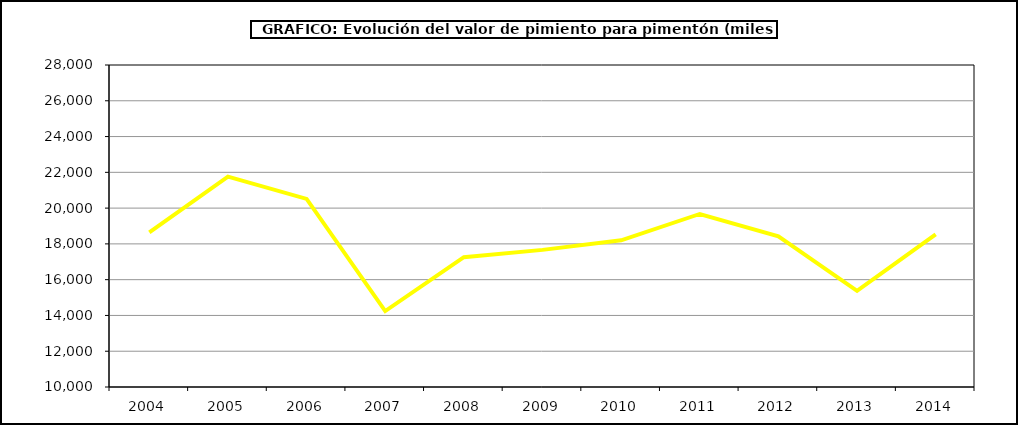
| Category | Valor |
|---|---|
| 2004.0 | 18641.666 |
| 2005.0 | 21763.465 |
| 2006.0 | 20516.405 |
| 2007.0 | 14247.039 |
| 2008.0 | 17258.828 |
| 2009.0 | 17665.33 |
| 2010.0 | 18201.072 |
| 2011.0 | 19672.3 |
| 2012.0 | 18426.65 |
| 2013.0 | 15378.158 |
| 2014.0 | 18538.464 |